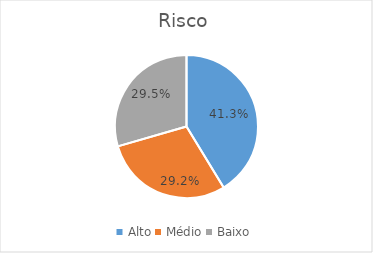
| Category | Contagem |
|---|---|
| Alto | 0.413 |
| Médio | 0.292 |
| Baixo | 0.295 |